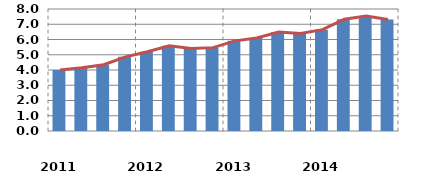
| Category | Series 0 |
|---|---|
|               2011 | 4 |
|  | 4.146 |
|  | 4.344 |
|  | 4.863 |
|               2012 | 5.2 |
|  | 5.583 |
|  | 5.404 |
|  | 5.467 |
|               2013 | 5.911 |
|  | 6.101 |
|  | 6.496 |
|  | 6.392 |
|               2014 | 6.645 |